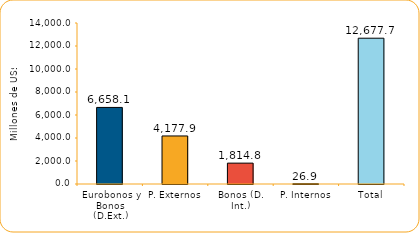
| Category | Series 1 |
|---|---|
| Eurobonos y Bonos (D.Ext.) | 6658.1 |
| P. Externos | 4177.9 |
| Bonos (D. Int.) | 1814.8 |
| P. Internos | 26.9 |
| Total | 12677.7 |